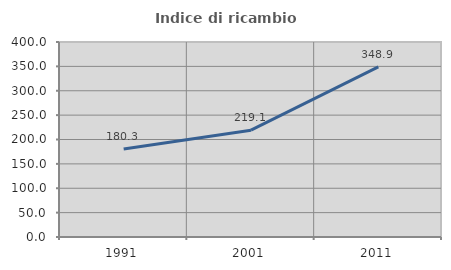
| Category | Indice di ricambio occupazionale  |
|---|---|
| 1991.0 | 180.349 |
| 2001.0 | 219.091 |
| 2011.0 | 348.925 |